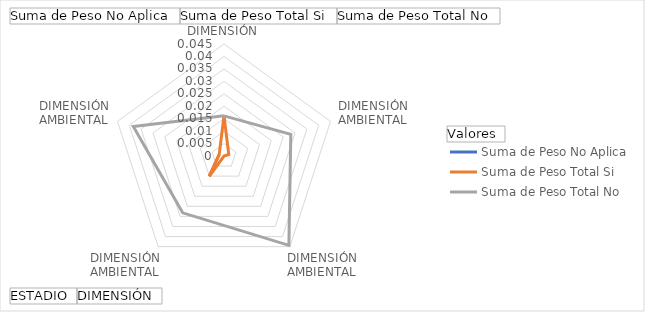
| Category | Suma de Peso No Aplica | Suma de Peso Total Si | Suma de Peso Total No |
|---|---|---|---|
| 0 |  | 0.016 | 0.016 |
| 1 |  | 0.002 | 0.028 |
| 2 |  | 0 | 0.044 |
| 3 |  | 0.01 | 0.028 |
| 4 |  | 0.002 | 0.038 |